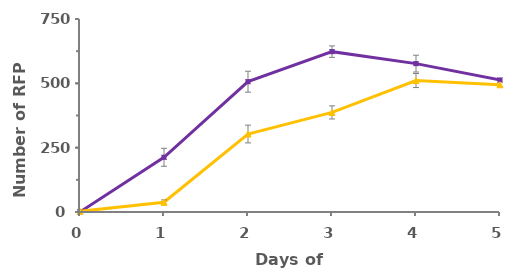
| Category | dnj-21 RNAi | Ctrl. |
|---|---|---|
| 0.0 | 0.4 | 2.625 |
| 1.0 | 212.571 | 37.786 |
| 2.0 | 506.438 | 303.062 |
| 3.0 | 623.125 | 387 |
| 4.0 | 576.643 | 510.933 |
| 5.0 | 512.875 | 494.333 |